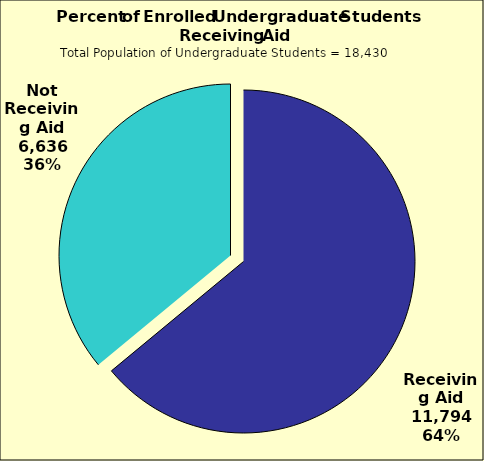
| Category | Series 0 |
|---|---|
| Receiving Aid | 11794 |
| Not Receiving Aid | 6636 |